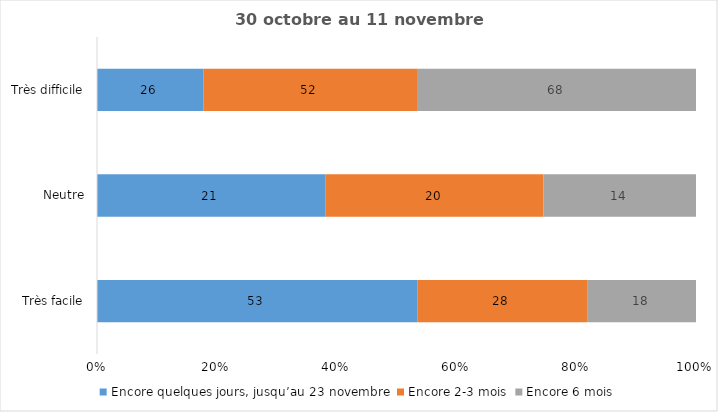
| Category | Encore quelques jours, jusqu’au 23 novembre | Encore 2-3 mois | Encore 6 mois |
|---|---|---|---|
| Très facile | 53 | 28 | 18 |
| Neutre | 21 | 20 | 14 |
| Très difficile | 26 | 52 | 68 |